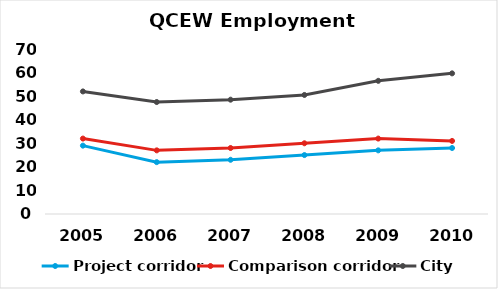
| Category | Project corridor | Comparison corridor | City |
|---|---|---|---|
| 2005.0 | 29 | 32 | 52 |
| 2006.0 | 22 | 27 | 47.5 |
| 2007.0 | 23 | 28 | 48.5 |
| 2008.0 | 25 | 30 | 50.5 |
| 2009.0 | 27 | 32 | 56.5 |
| 2010.0 | 28 | 31 | 59.667 |